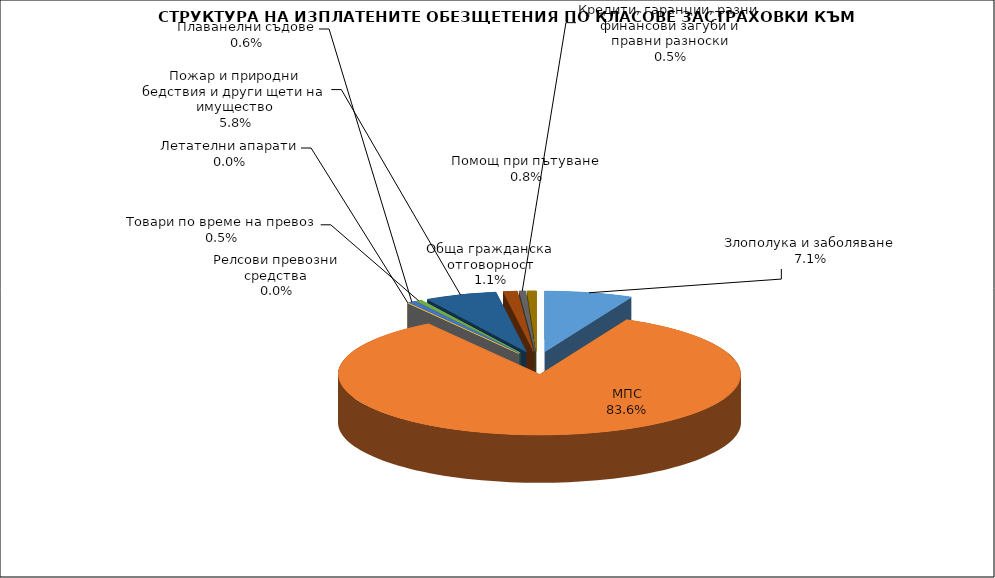
| Category | Злополука и заболяване МПС Релсови превозни средства Летателни апарати Плаванелни съдове Товари по време на превоз Пожар и природни бедствия и други щети на имущество Обща гражданска отговорност Кредити, гаранции, разни финансови загуби и правни разноски  |
|---|---|
| Злополука и заболяване | 0.071 |
| МПС | 0.836 |
| Релсови превозни средства | 0 |
| Летателни апарати | 0 |
| Плаванелни съдове | 0.006 |
| Товари по време на превоз | 0.005 |
| Пожар и природни бедствия и други щети на имущество | 0.058 |
| Обща гражданска отговорност | 0.011 |
| Кредити, гаранции, разни финансови загуби и правни разноски | 0.005 |
| Помощ при пътуване | 0.008 |